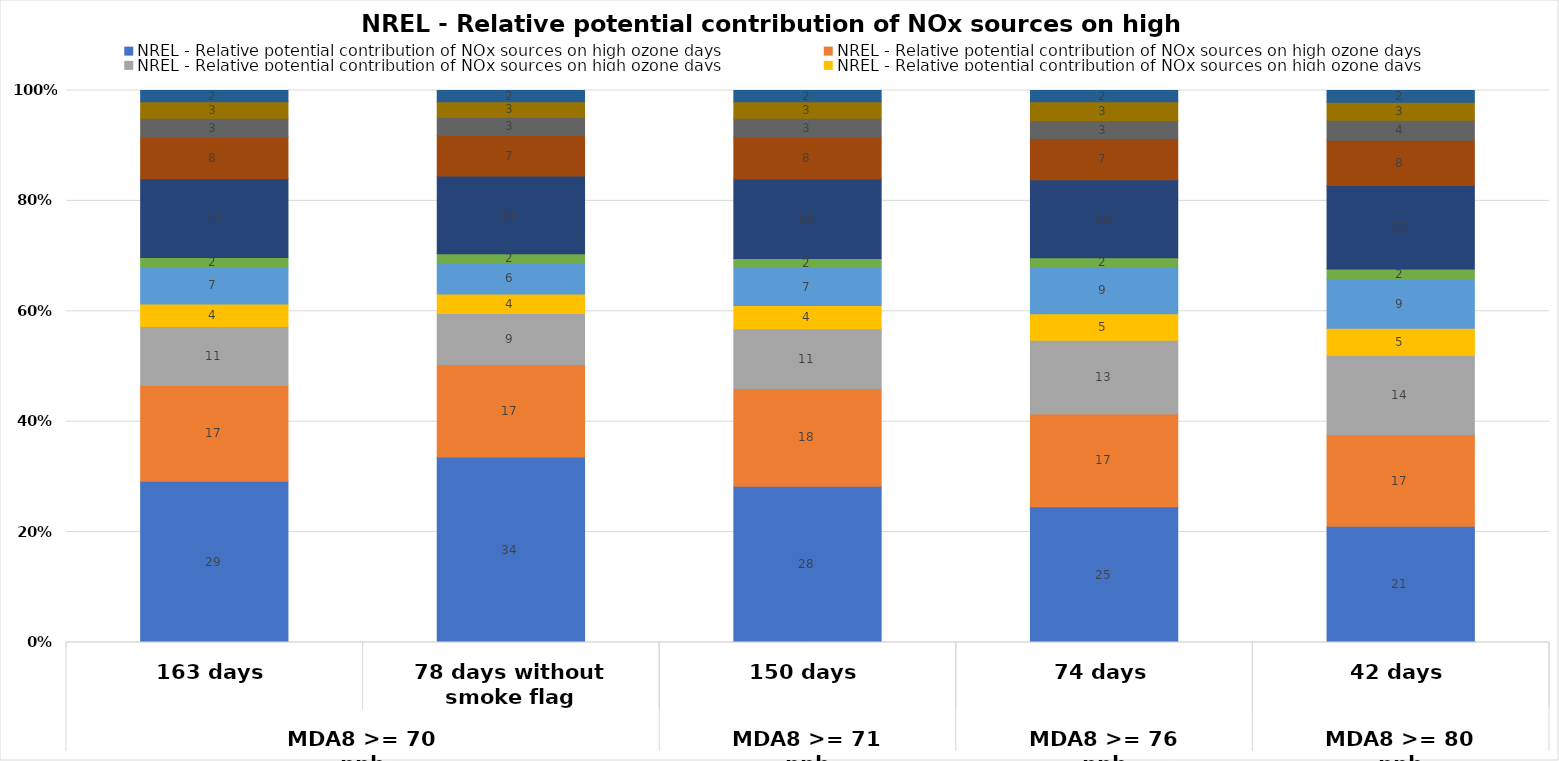
| Category | EGU Point | Non-EGU Point | O&G Area | O&G Point | O&G pre-production | Nonpoint | On-road Mobile | Other Non-road Mobile | Lawn & Garden Equipment | Airports | Rail |
|---|---|---|---|---|---|---|---|---|---|---|---|
| 0 | 29.229 | 17.321 | 10.689 | 4.096 | 6.755 | 1.641 | 14.297 | 7.566 | 3.393 | 2.973 | 2.041 |
| 1 | 33.609 | 16.76 | 9.253 | 3.505 | 5.694 | 1.602 | 14.077 | 7.335 | 3.339 | 2.799 | 2.027 |
| 2 | 28.317 | 17.715 | 10.822 | 4.194 | 6.873 | 1.645 | 14.38 | 7.625 | 3.395 | 2.987 | 2.047 |
| 3 | 24.591 | 16.795 | 13.383 | 4.796 | 8.552 | 1.601 | 14.096 | 7.488 | 3.255 | 3.416 | 2.029 |
| 4 | 21.046 | 16.585 | 14.363 | 4.915 | 8.925 | 1.817 | 15.139 | 8.201 | 3.624 | 3.271 | 2.115 |